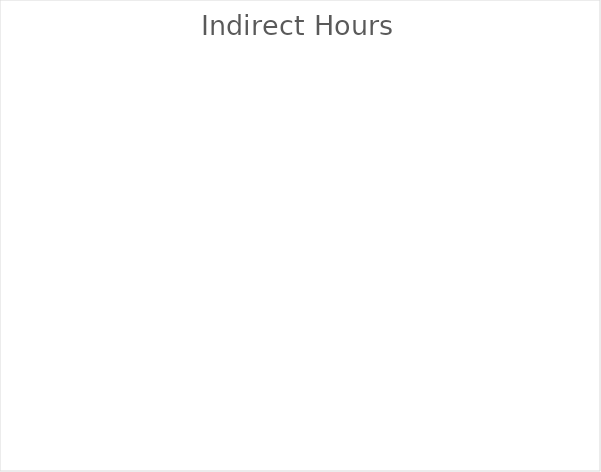
| Category | Series 0 |
|---|---|
| 8. Writing interview summaries/Documentation | 0 |
| 9. Site Supervision | 0 |
| 10. Doctoral Supervision  | 0 |
| 11. Attending practicum /intern class | 0 |
| 12. Listening to own recordings | 0 |
| 13. Listening to recordings of others | 0 |
| 14. Record Keeping | 0 |
| 15. Consulting records | 0 |
| 16. Locating clients | 0 |
| 17. Orientation to site | 0 |
| 18. Other activities (list) | 0 |